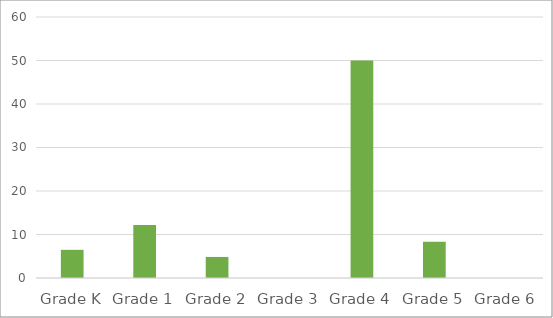
| Category | Series 0 |
|---|---|
| Grade K | 6.473 |
| Grade 1 | 12.166 |
| Grade 2 | 4.839 |
| Grade 3 | 0 |
| Grade 4 | 50 |
| Grade 5 | 8.333 |
| Grade 6 | 0 |